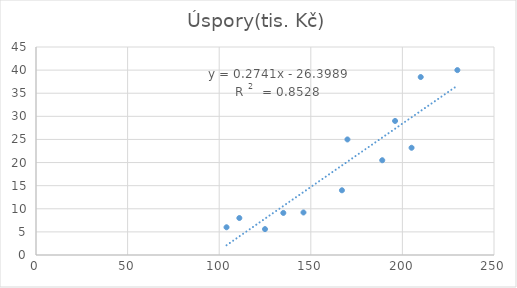
| Category | Úspory(tis. Kč) |
|---|---|
| 104.0 | 6 |
| 125.0 | 5.6 |
| 146.0 | 9.2 |
| 167.0 | 14 |
| 111.0 | 8 |
| 135.0 | 9.1 |
| 189.0 | 20.5 |
| 196.0 | 29 |
| 205.0 | 23.2 |
| 210.0 | 38.5 |
| 170.0 | 25 |
| 230.0 | 40 |